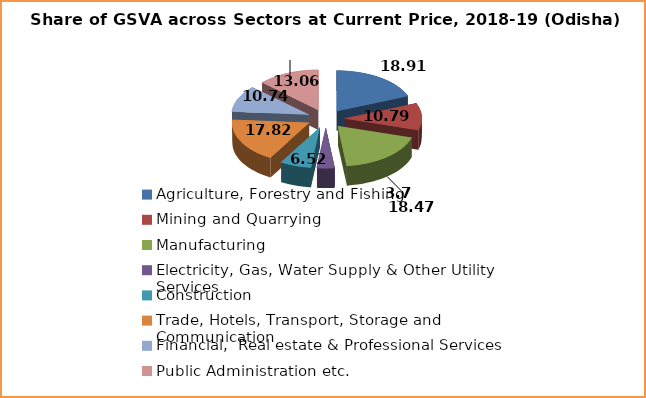
| Category |  Share of GSVA  2018-19 (A) |
|---|---|
| Agriculture, Forestry and Fishing | 18.91 |
| Mining and Quarrying | 10.79 |
| Manufacturing | 18.47 |
| Electricity, Gas, Water Supply & Other Utility Services | 3.7 |
| Construction | 6.52 |
| Trade, Hotels, Transport, Storage and Communication  | 17.82 |
| Financial,  Real estate & Professional Services | 10.74 |
| Public Administration etc. | 13.06 |